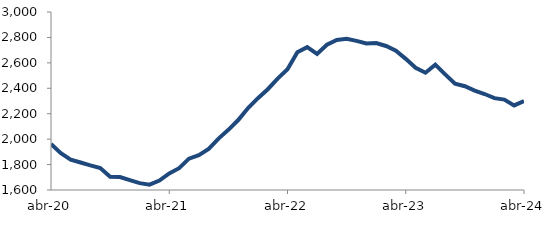
| Category | Series 0 |
|---|---|
| 2020-04-01 | 1961.731 |
| 2020-05-01 | 1889.917 |
| 2020-06-01 | 1839.086 |
| 2020-07-01 | 1816.171 |
| 2020-08-01 | 1793.174 |
| 2020-09-01 | 1772.502 |
| 2020-10-01 | 1703.481 |
| 2020-11-01 | 1701.776 |
| 2020-12-01 | 1677.184 |
| 2021-01-01 | 1654.072 |
| 2021-02-01 | 1641.869 |
| 2021-03-01 | 1673.821 |
| 2021-04-01 | 1730.759 |
| 2021-05-01 | 1771.425 |
| 2021-06-01 | 1846.573 |
| 2021-07-01 | 1874.111 |
| 2021-08-01 | 1922.894 |
| 2021-09-01 | 2004.225 |
| 2021-10-01 | 2073.331 |
| 2021-11-01 | 2150.314 |
| 2021-12-01 | 2244.492 |
| 2022-01-01 | 2321.95 |
| 2022-02-01 | 2392.65 |
| 2022-03-01 | 2476.383 |
| 2022-04-01 | 2549.069 |
| 2022-05-01 | 2683.336 |
| 2022-06-01 | 2723.868 |
| 2022-07-01 | 2670.585 |
| 2022-08-01 | 2742.913 |
| 2022-09-01 | 2780.46 |
| 2022-10-01 | 2788.916 |
| 2022-11-01 | 2772.628 |
| 2022-12-01 | 2752.307 |
| 2023-01-01 | 2755.69 |
| 2023-02-01 | 2732.653 |
| 2023-03-01 | 2696.107 |
| 2023-04-01 | 2631.454 |
| 2023-05-01 | 2561.826 |
| 2023-06-01 | 2522.703 |
| 2023-07-01 | 2586.296 |
| 2023-08-01 | 2509.777 |
| 2023-09-01 | 2436.109 |
| 2023-10-01 | 2416.11 |
| 2023-11-01 | 2381.816 |
| 2023-12-01 | 2354.903 |
| 2024-01-01 | 2322.347 |
| 2024-02-01 | 2311.108 |
| 2024-03-01 | 2265.037 |
| 2024-04-01 | 2299.687 |